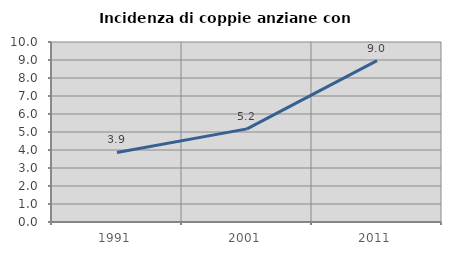
| Category | Incidenza di coppie anziane con figli |
|---|---|
| 1991.0 | 3.865 |
| 2001.0 | 5.172 |
| 2011.0 | 8.966 |